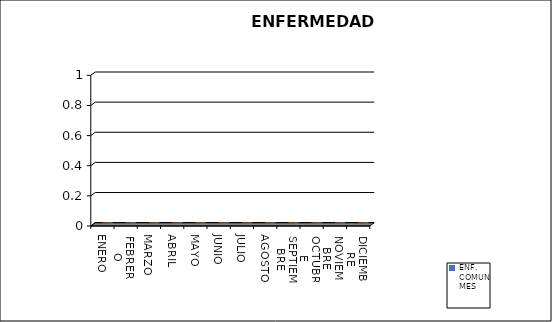
| Category | ENF. COMUN |
|---|---|
| ENERO | 0 |
| FEBRERO | 0 |
| MARZO | 0 |
| ABRIL | 0 |
| MAYO | 0 |
| JUNIO | 0 |
| JULIO | 0 |
| AGOSTO | 0 |
| SEPTIEMBRE | 0 |
| OCTUBRE | 0 |
| NOVIEMBRE | 0 |
| DICIEMBRE | 0 |